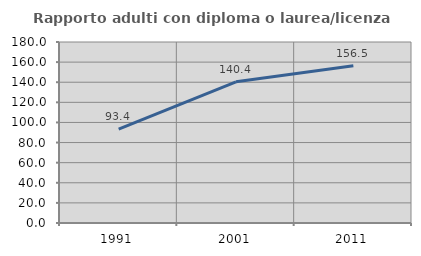
| Category | Rapporto adulti con diploma o laurea/licenza media  |
|---|---|
| 1991.0 | 93.396 |
| 2001.0 | 140.426 |
| 2011.0 | 156.471 |